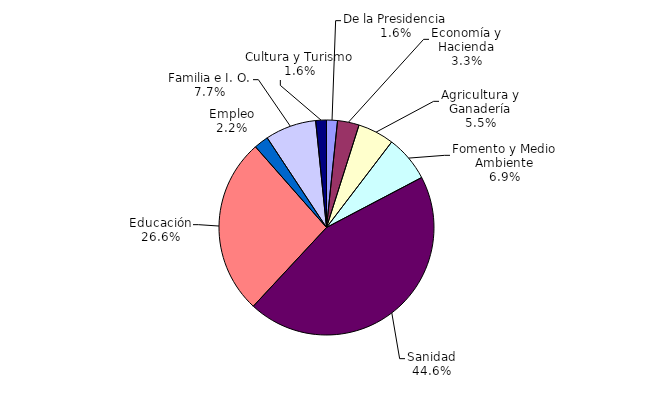
| Category | Series 0 |
|---|---|
| De la Presidencia | 121954.4 |
| Economía y Hacienda | 241861.8 |
| Agricultura y Ganadería | 406371.3 |
| Fomento y Medio Ambiente | 515529.7 |
| Sanidad | 3316343.4 |
| Educación | 1976256.6 |
| Empleo | 162624.6 |
| Familia e I. O. | 571077.3 |
| Cultura y Turismo | 120206.2 |